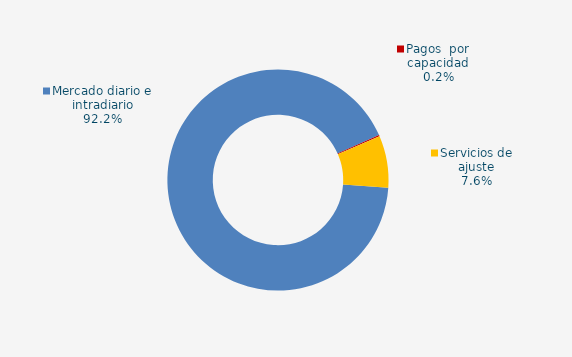
| Category | Series 0 |
|---|---|
| Mercado diario e intradiario | 97.02 |
| Pagos  por capacidad | 0.19 |
| Mecanismo ajuste RD-L 10/2022 | 0 |
| Servicios de ajuste | 7.99 |